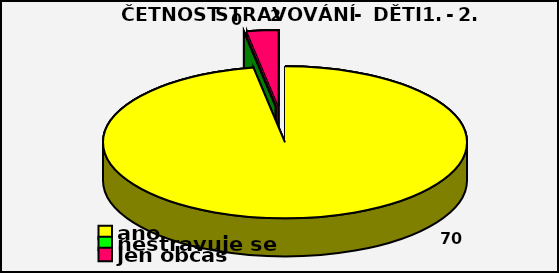
| Category | Series 0 |
|---|---|
| ano | 70 |
| nestravuje se  | 0 |
| jen občas | 2 |